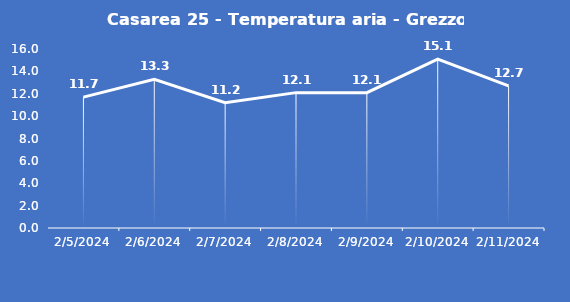
| Category | Casarea 25 - Temperatura aria - Grezzo (°C) |
|---|---|
| 2/5/24 | 11.7 |
| 2/6/24 | 13.3 |
| 2/7/24 | 11.2 |
| 2/8/24 | 12.1 |
| 2/9/24 | 12.1 |
| 2/10/24 | 15.1 |
| 2/11/24 | 12.7 |